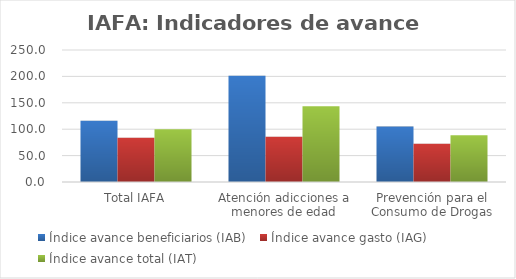
| Category | Índice avance beneficiarios (IAB)  | Índice avance gasto (IAG) | Índice avance total (IAT)  |
|---|---|---|---|
| Total IAFA | 115.842 | 83.901 | 99.872 |
| Atención adicciones a menores de edad | 201.08 | 85.718 | 143.399 |
| Prevención para el Consumo de Drogas | 105.044 | 72.401 | 88.723 |